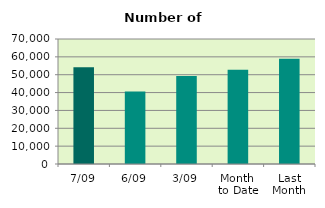
| Category | Series 0 |
|---|---|
| 7/09 | 54148 |
| 6/09 | 40626 |
| 3/09 | 49284 |
| Month 
to Date | 52802.4 |
| Last
Month | 58874.818 |